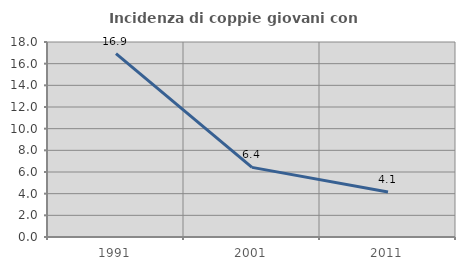
| Category | Incidenza di coppie giovani con figli |
|---|---|
| 1991.0 | 16.929 |
| 2001.0 | 6.426 |
| 2011.0 | 4.149 |